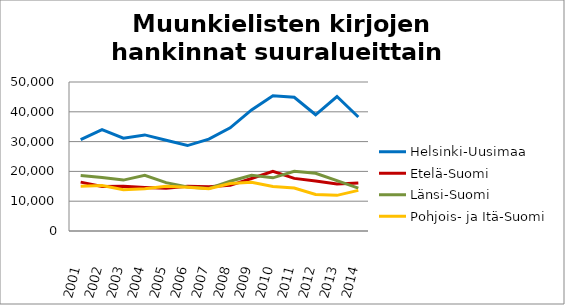
| Category | Helsinki-Uusimaa | Etelä-Suomi | Länsi-Suomi | Pohjois- ja Itä-Suomi |
|---|---|---|---|---|
| 2001.0 | 30672 | 16398 | 18638 | 15052 |
| 2002.0 | 34036 | 14963 | 17954 | 15290 |
| 2003.0 | 31169 | 15035 | 17082 | 13835 |
| 2004.0 | 32247 | 14631 | 18662 | 14217 |
| 2005.0 | 30480 | 14376 | 16223 | 14982 |
| 2006.0 | 28669 | 15010 | 14798 | 14691 |
| 2007.0 | 30831 | 14831 | 14265 | 14195 |
| 2008.0 | 34614 | 15331 | 16703 | 15955 |
| 2009.0 | 40633 | 17599 | 18679 | 16318 |
| 2010.0 | 45354 | 19984 | 17840 | 14937 |
| 2011.0 | 44857 | 17650 | 20055 | 14419 |
| 2012.0 | 39002 | 16770 | 19389 | 12230 |
| 2013.0 | 45130 | 15738 | 16877 | 11962 |
| 2014.0 | 38247 | 16109 | 14389 | 13631 |